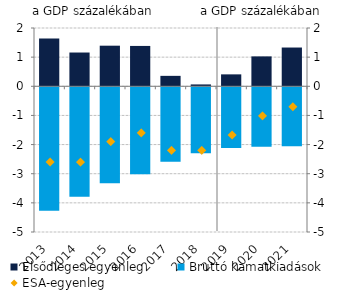
| Category | Elsődleges egyenleg | Bruttó kamatkiadások |
|---|---|---|
| 2013.0 | 1.641 | -4.241 |
| 2014.0 | 1.159 | -3.759 |
| 2015.0 | 1.393 | -3.293 |
| 2016.0 | 1.385 | -2.985 |
| 2017.0 | 0.358 | -2.558 |
| 2018.0 | 0.064 | -2.264 |
| 2019.0 | 0.409 | -2.082 |
| 2020.0 | 1.026 | -2.038 |
| 2021.0 | 1.33 | -2.027 |